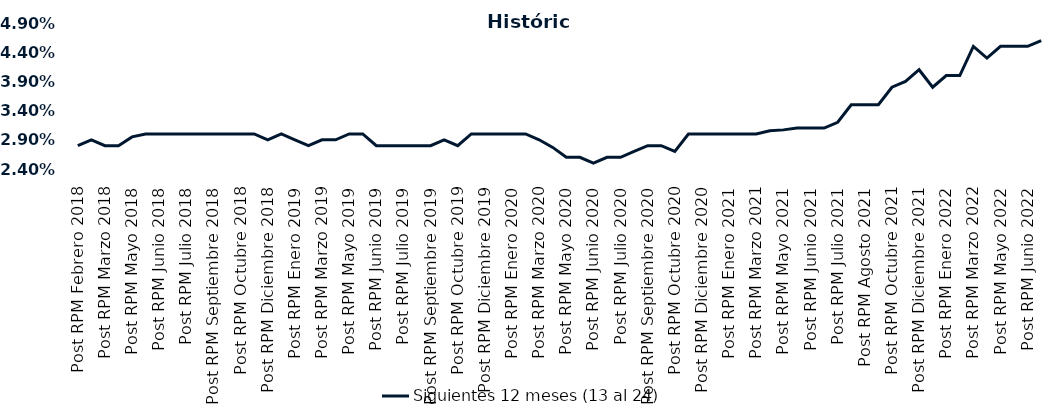
| Category | Siguientes 12 meses (13 al 24)  |
|---|---|
| Post RPM Febrero 2018 | 0.028 |
| Pre RPM Marzo 2018 | 0.029 |
| Post RPM Marzo 2018 | 0.028 |
| Pre RPM Mayo 2018 | 0.028 |
| Post RPM Mayo 2018 | 0.03 |
| Pre RPM Junio 2018 | 0.03 |
| Post RPM Junio 2018 | 0.03 |
| Pre RPM Julio 2018 | 0.03 |
| Post RPM Julio 2018 | 0.03 |
| Pre RPM Septiembre 2018 | 0.03 |
| Post RPM Septiembre 2018 | 0.03 |
| Pre RPM Octubre 2018 | 0.03 |
| Post RPM Octubre 2018 | 0.03 |
| Pre RPM Diciembre 2018 | 0.03 |
| Post RPM Diciembre 2018 | 0.029 |
| Pre RPM Enero 2019 | 0.03 |
| Post RPM Enero 2019 | 0.029 |
| Pre RPM Marzo 2019 | 0.028 |
| Post RPM Marzo 2019 | 0.029 |
| Pre RPM Mayo 2019 | 0.029 |
| Post RPM Mayo 2019 | 0.03 |
| Pre RPM Junio 2019 | 0.03 |
| Post RPM Junio 2019 | 0.028 |
| Pre RPM Julio 2019 | 0.028 |
| Post RPM Julio 2019 | 0.028 |
| Pre RPM Septiembre 2019 | 0.028 |
| Post RPM Septiembre 2019 | 0.028 |
| Pre RPM Octubre 2019 | 0.029 |
| Post RPM Octubre 2019 | 0.028 |
| Pre RPM Diciembre 2019 | 0.03 |
| Post RPM Diciembre 2019 | 0.03 |
| Pre RPM Enero 2020 | 0.03 |
| Post RPM Enero 2020 | 0.03 |
| Pre RPM Marzo 2020 | 0.03 |
| Post RPM Marzo 2020 | 0.029 |
| Pre RPM Mayo 2020 | 0.028 |
| Post RPM Mayo 2020 | 0.026 |
| Pre RPM Junio 2020 | 0.026 |
| Post RPM Junio 2020 | 0.025 |
| Pre RPM Julio 2020 | 0.026 |
| Post RPM Julio 2020 | 0.026 |
| Pre RPM Septiembre 2020 | 0.027 |
| Post RPM Septiembre 2020 | 0.028 |
| Pre RPM Octubre 2020 | 0.028 |
| Post RPM Octubre 2020 | 0.027 |
| Pre RPM Diciembre 2020 | 0.03 |
| Post RPM Diciembre 2020 | 0.03 |
| Pre RPM Enero 2021 | 0.03 |
| Post RPM Enero 2021 | 0.03 |
| Pre RPM Marzo 2021 | 0.03 |
| Post RPM Marzo 2021 | 0.03 |
| Pre RPM Mayo 2021 | 0.031 |
| Post RPM Mayo 2021 | 0.031 |
| Pre RPM Junio 2021 | 0.031 |
| Post RPM Junio 2021 | 0.031 |
| Pre RPM Julio 2021 | 0.031 |
| Post RPM Julio 2021 | 0.032 |
| Pre RPM Agosto 2021 | 0.035 |
| Post RPM Agosto 2021 | 0.035 |
| Pre RPM Octubre 2021 | 0.035 |
| Post RPM Octubre 2021 | 0.038 |
| Pre RPM Diciembre 2021 | 0.039 |
| Post RPM Diciembre 2021 | 0.041 |
| Pre RPM Enero 2022 | 0.038 |
| Post RPM Enero 2022 | 0.04 |
| Pre RPM Marzo 2022 | 0.04 |
| Post RPM Marzo 2022 | 0.045 |
| Pre RPM Mayo 2022 | 0.043 |
| Post RPM Mayo 2022 | 0.045 |
| Pre RPM Junio 2022 | 0.045 |
| Post RPM Junio 2022 | 0.045 |
| Pre RPM Julio 2022 | 0.046 |